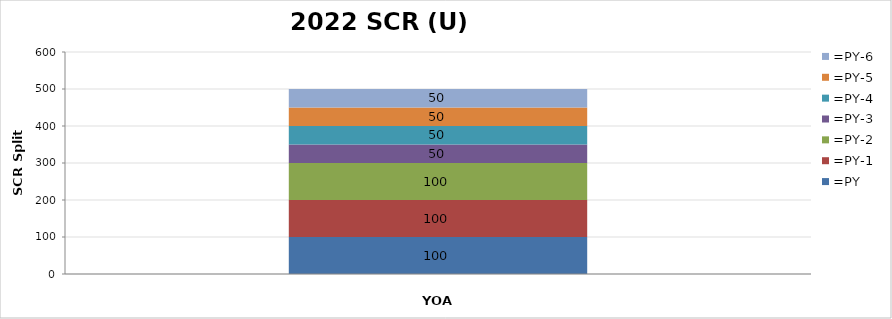
| Category | =PY | =PY-1 | =PY-2 | =PY-3 | =PY-4 | =PY-5 | =PY-6 |
|---|---|---|---|---|---|---|---|
|  | 100 | 100 | 100 | 50 | 50 | 50 | 50 |